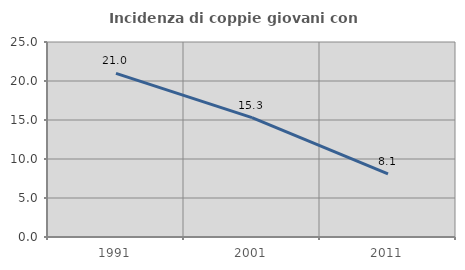
| Category | Incidenza di coppie giovani con figli |
|---|---|
| 1991.0 | 20.971 |
| 2001.0 | 15.304 |
| 2011.0 | 8.081 |